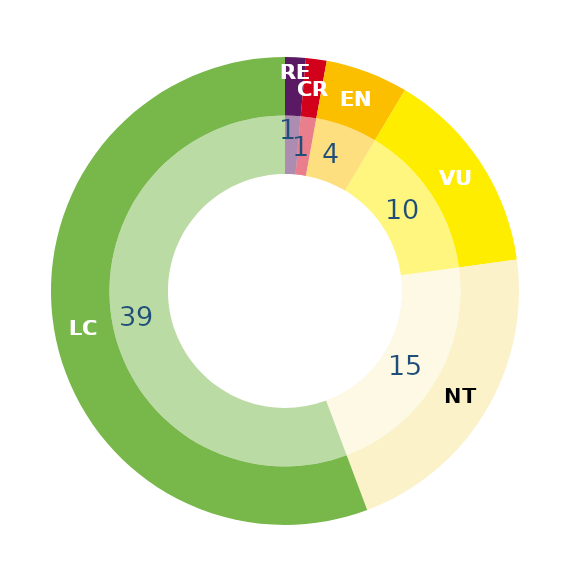
| Category | Series 1 | Series 0 |
|---|---|---|
| RE | 1 | 1 |
| CR | 1 | 1 |
| EN | 4 | 4 |
| VU | 10 | 10 |
| NT | 15 | 15 |
| LC | 39 | 39 |
| DD | 0 | 0 |